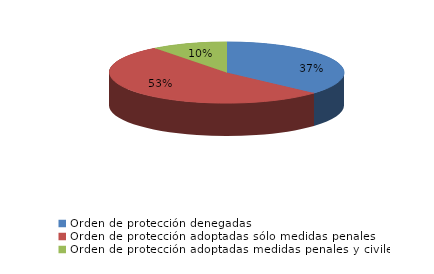
| Category | Series 0 |
|---|---|
| Orden de protección denegadas | 81 |
| Orden de protección adoptadas sólo medidas penales | 117 |
| Orden de protección adoptadas medidas penales y civiles | 23 |